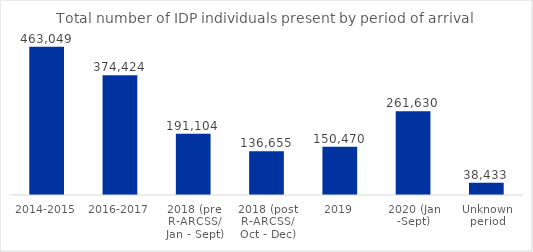
| Category | Total |
|---|---|
| 2014-2015 | 463049 |
| 2016-2017 | 374424 |
| 2018 (pre R-ARCSS/ Jan - Sept) | 191104 |
| 2018 (post R-ARCSS/ Oct - Dec) | 136655 |
| 2019 | 150470 |
| 2020 (Jan -Sept) | 261630 |
| Unknown period | 38433 |